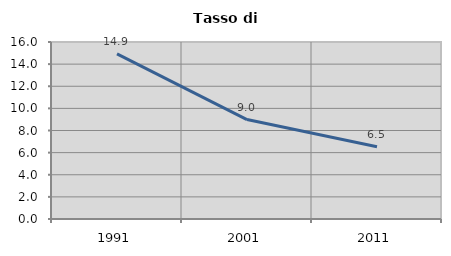
| Category | Tasso di disoccupazione   |
|---|---|
| 1991.0 | 14.921 |
| 2001.0 | 8.987 |
| 2011.0 | 6.531 |